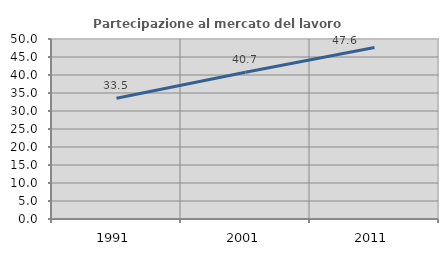
| Category | Partecipazione al mercato del lavoro  femminile |
|---|---|
| 1991.0 | 33.517 |
| 2001.0 | 40.747 |
| 2011.0 | 47.619 |